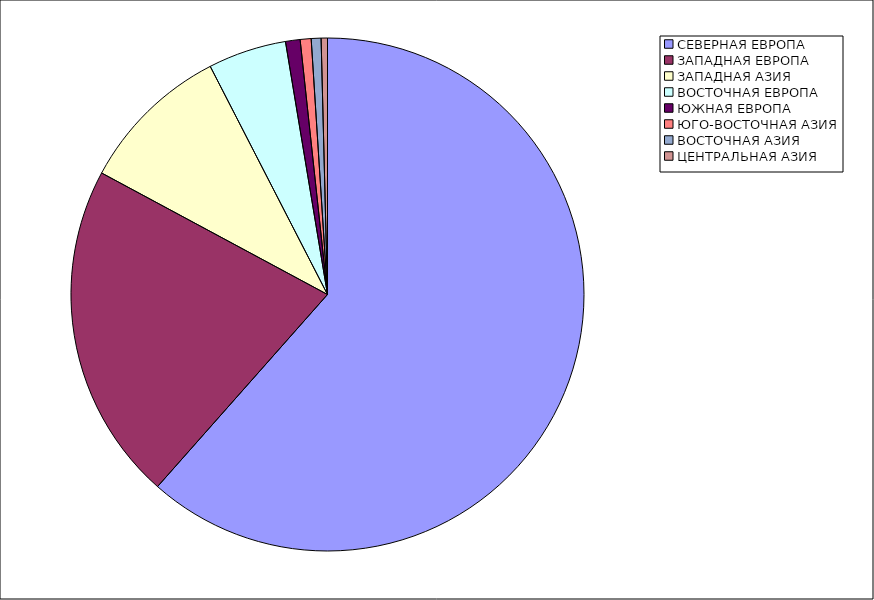
| Category | Оборот |
|---|---|
| СЕВЕРНАЯ ЕВРОПА | 61.528 |
| ЗАПАДНАЯ ЕВРОПА | 21.326 |
| ЗАПАДНАЯ АЗИЯ | 9.588 |
| ВОСТОЧНАЯ ЕВРОПА | 4.936 |
| ЮЖНАЯ ЕВРОПА | 0.918 |
| ЮГО-ВОСТОЧНАЯ АЗИЯ | 0.689 |
| ВОСТОЧНАЯ АЗИЯ | 0.617 |
| ЦЕНТРАЛЬНАЯ АЗИЯ | 0.398 |